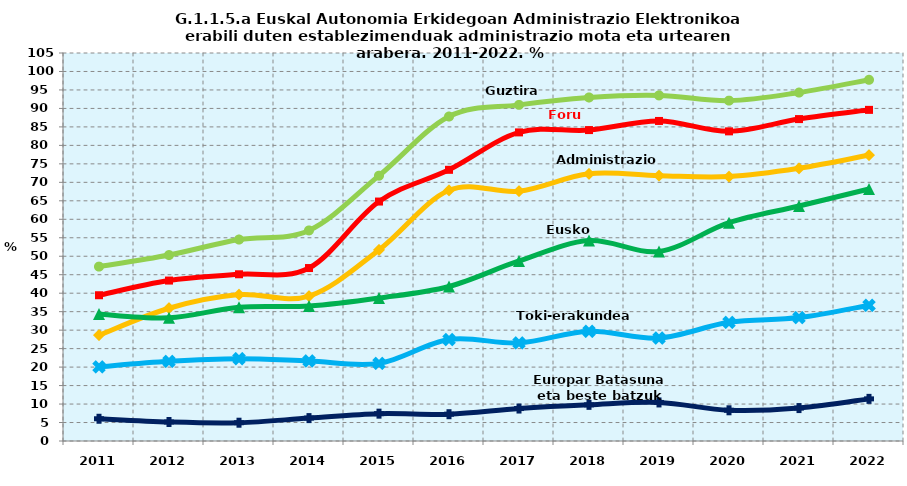
| Category | Guztira | Foru aldundiak | Administrazio Zentrala | Eusko Jaurlaritza | Toki-erakundeak | Europar Batasuna eta beste batzuk |
|---|---|---|---|---|---|---|
| 2011.0 | 47.195 | 39.446 | 28.619 | 34.347 | 20.063 | 6.017 |
| 2012.0 | 50.321 | 43.417 | 35.926 | 33.339 | 21.568 | 5.144 |
| 2013.0 | 54.524 | 45.118 | 39.622 | 36.207 | 22.264 | 4.948 |
| 2014.0 | 56.986 | 46.807 | 39.221 | 36.539 | 21.658 | 6.198 |
| 2015.0 | 71.8 | 64.8 | 51.7 | 38.7 | 21 | 7.4 |
| 2016.0 | 87.813 | 73.385 | 67.853 | 41.82 | 27.461 | 7.249 |
| 2017.0 | 90.959 | 83.514 | 67.612 | 48.718 | 26.543 | 8.784 |
| 2018.0 | 92.961 | 84.142 | 72.311 | 54.229 | 29.694 | 9.782 |
| 2019.0 | 93.517 | 86.609 | 71.787 | 51.305 | 27.87 | 10.432 |
| 2020.0 | 92.114 | 83.794 | 71.565 | 59.083 | 32.123 | 8.311 |
| 2021.0 | 94.294 | 87.114 | 73.798 | 63.597 | 33.395 | 8.911 |
| 2022.0 | 97.747 | 89.61 | 77.383 | 68.196 | 36.727 | 11.402 |